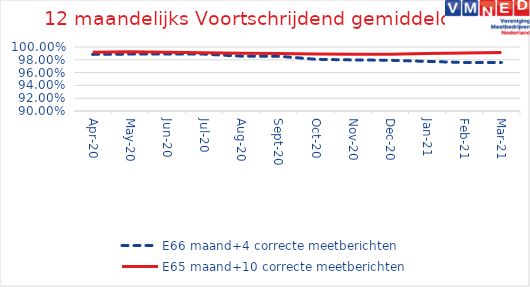
| Category | E66 maand+4 correcte meetberichten | E65 maand+10 correcte meetberichten |
|---|---|---|
| 2020-04-01 | 0.988 | 0.992 |
| 2020-05-01 | 0.989 | 0.993 |
| 2020-06-01 | 0.989 | 0.992 |
| 2020-07-01 | 0.989 | 0.991 |
| 2020-08-01 | 0.986 | 0.99 |
| 2020-09-01 | 0.986 | 0.99 |
| 2020-10-01 | 0.981 | 0.989 |
| 2020-11-01 | 0.98 | 0.989 |
| 2020-12-01 | 0.979 | 0.989 |
| 2021-01-01 | 0.978 | 0.99 |
| 2021-02-01 | 0.976 | 0.991 |
| 2021-03-01 | 0.976 | 0.991 |